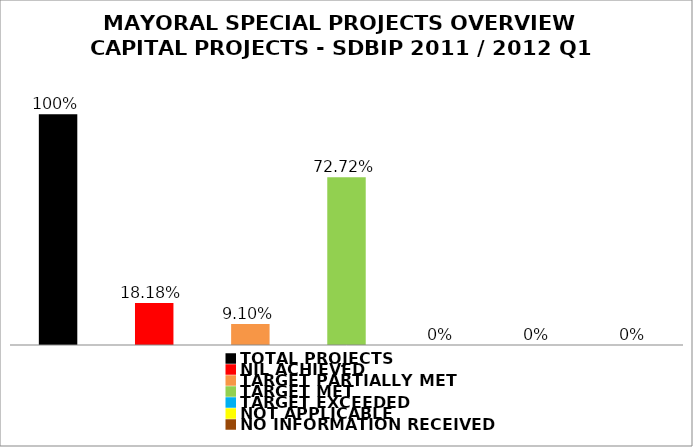
| Category | Series 1 |
|---|---|
| TOTAL PROJECTS | 1 |
| NIL ACHIEVED | 0.182 |
| TARGET PARTIALLY MET | 0.091 |
| TARGET MET | 0.727 |
| TARGET EXCEEDED | 0 |
| NOT APPLICABLE | 0 |
| NO INFORMATION RECEIVED | 0 |